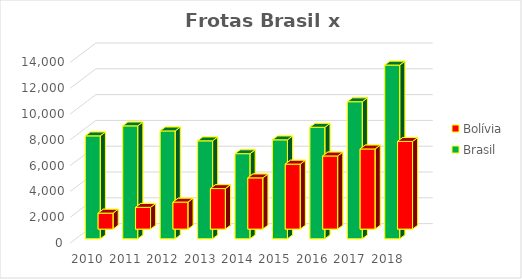
| Category | Bolívia | Brasil |
|---|---|---|
| 2010.0 | 1241 | 7978 |
| 2011.0 | 1686 | 8752 |
| 2012.0 | 2094 | 8361 |
| 2013.0 | 3143 | 7591 |
| 2014.0 | 3970 | 6597 |
| 2015.0 | 5037 | 7669 |
| 2016.0 | 5669 | 8645 |
| 2017.0 | 6212 | 10624 |
| 2018.0 | 6796 | 13465 |